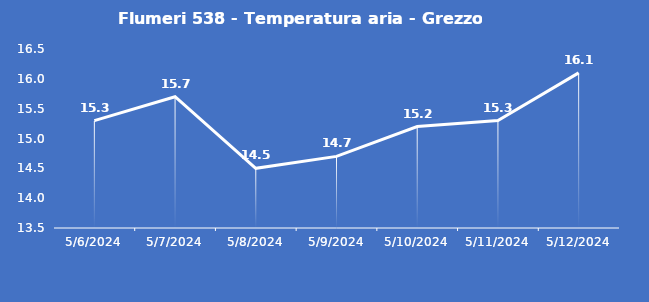
| Category | Flumeri 538 - Temperatura aria - Grezzo (°C) |
|---|---|
| 5/6/24 | 15.3 |
| 5/7/24 | 15.7 |
| 5/8/24 | 14.5 |
| 5/9/24 | 14.7 |
| 5/10/24 | 15.2 |
| 5/11/24 | 15.3 |
| 5/12/24 | 16.1 |